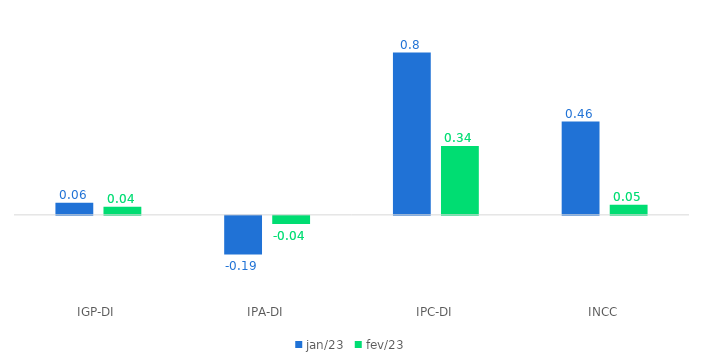
| Category | jan/23 | fev/23 |
|---|---|---|
| IGP-DI | 0.06 | 0.04 |
| IPA-DI | -0.19 | -0.04 |
| IPC-DI | 0.8 | 0.34 |
| INCC | 0.46 | 0.05 |